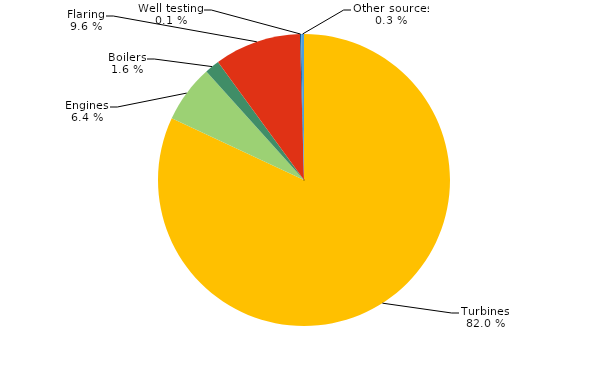
| Category | Series 0 |
|---|---|
| Turbines | 10.934 |
| Engines | 0.852 |
| Boilers | 0.218 |
| Flaring | 1.278 |
| Well testing | 0.017 |
| Other sources | 0.042 |